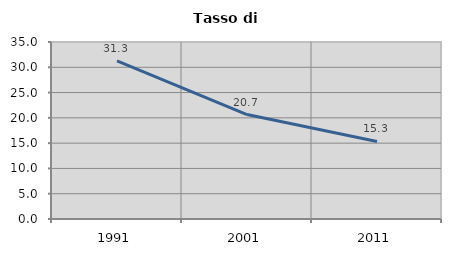
| Category | Tasso di disoccupazione   |
|---|---|
| 1991.0 | 31.258 |
| 2001.0 | 20.654 |
| 2011.0 | 15.34 |